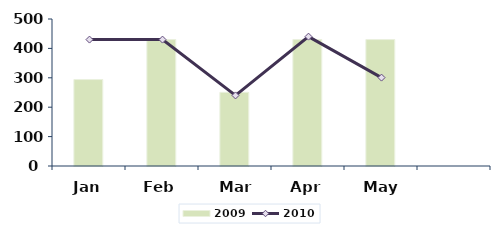
| Category | 2009 |
|---|---|
| Jan | 31.75 |
| Feb | 30 |
| Mar | 0 |
| Apr | 42 |
| May | 21 |